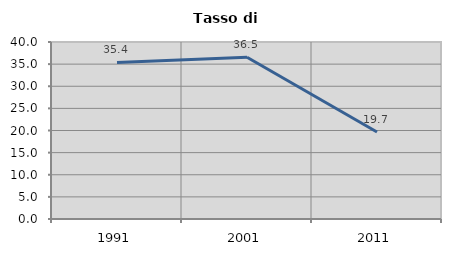
| Category | Tasso di disoccupazione   |
|---|---|
| 1991.0 | 35.385 |
| 2001.0 | 36.538 |
| 2011.0 | 19.672 |